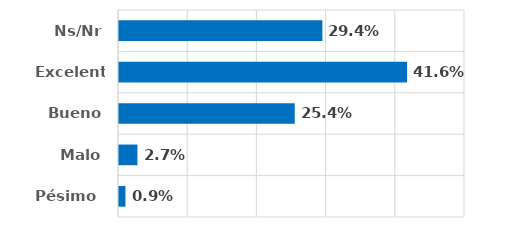
| Category | Series 0 |
|---|---|
| Pésimo  | 0.009 |
| Malo | 0.027 |
| Bueno | 0.254 |
| Excelente | 0.416 |
| Ns/Nr | 0.294 |